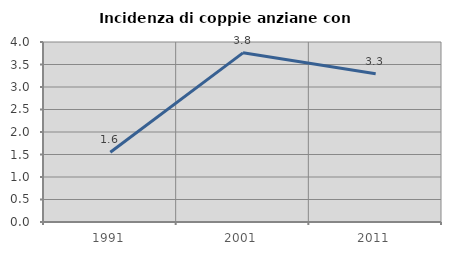
| Category | Incidenza di coppie anziane con figli |
|---|---|
| 1991.0 | 1.55 |
| 2001.0 | 3.759 |
| 2011.0 | 3.297 |